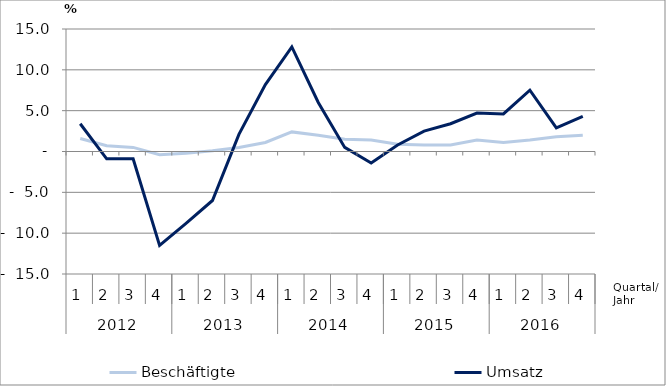
| Category | Beschäftigte | Umsatz |
|---|---|---|
| 0 | 1.6 | 3.4 |
| 1 | 0.7 | -0.9 |
| 2 | 0.5 | -0.9 |
| 3 | -0.4 | -11.5 |
| 4 | -0.2 | -8.8 |
| 5 | 0.1 | -6 |
| 6 | 0.5 | 2.1 |
| 7 | 1.1 | 8.2 |
| 8 | 2.4 | 12.8 |
| 9 | 2 | 6 |
| 10 | 1.5 | 0.5 |
| 11 | 1.4 | -1.4 |
| 12 | 0.9 | 0.8 |
| 13 | 0.8 | 2.5 |
| 14 | 0.8 | 3.4 |
| 15 | 1.4 | 4.7 |
| 16 | 1.1 | 4.6 |
| 17 | 1.4 | 7.5 |
| 18 | 1.8 | 2.9 |
| 19 | 2 | 4.3 |